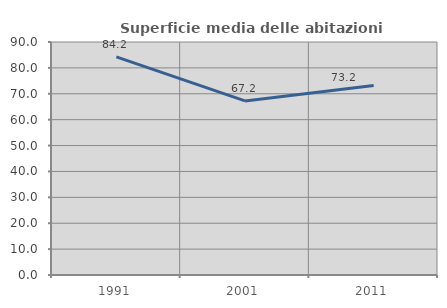
| Category | Superficie media delle abitazioni occupate |
|---|---|
| 1991.0 | 84.224 |
| 2001.0 | 67.231 |
| 2011.0 | 73.22 |